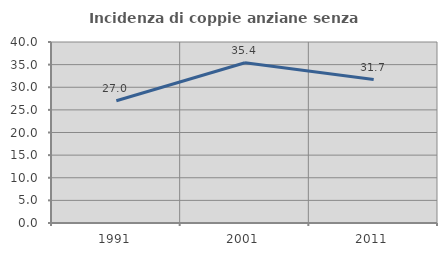
| Category | Incidenza di coppie anziane senza figli  |
|---|---|
| 1991.0 | 27.027 |
| 2001.0 | 35.417 |
| 2011.0 | 31.707 |